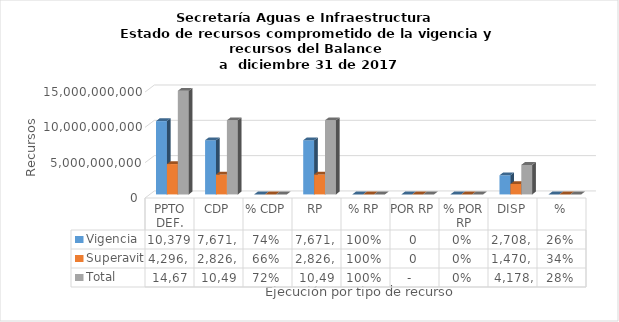
| Category | Vigencia | Superavit | Total |
|---|---|---|---|
| PPTO DEF. | 10379686018.28 | 4296634559 | 14676320577.28 |
| CDP | 7671431331.06 | 2826495062.25 | 10497926393.31 |
| % CDP | 0.739 | 0.658 | 0.715 |
| RP | 7671431331.06 | 2826495062.25 | 10497926393.31 |
| % RP | 1 | 1 | 1 |
| POR RP | 0 | 0 | 0 |
| % POR RP | 0 | 0 | 0 |
| DISP | 2708254687.22 | 1470139496.75 | 4178394183.97 |
| % | 0.261 | 0.342 | 0.285 |